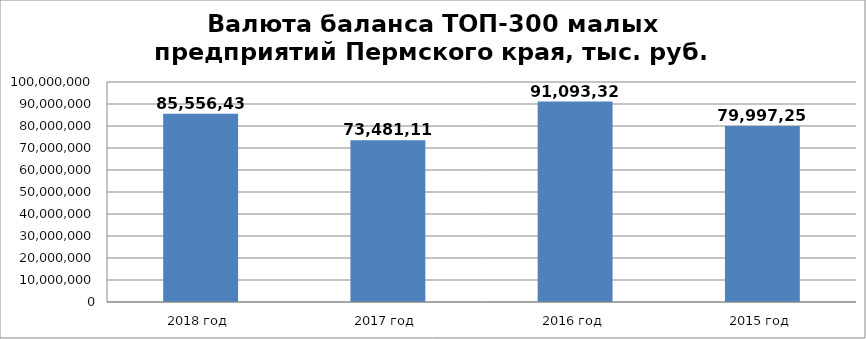
| Category | Series 0 |
|---|---|
| 2018 год | 85556439 |
| 2017 год | 73481119 |
| 2016 год | 91093321 |
| 2015 год | 79997258 |